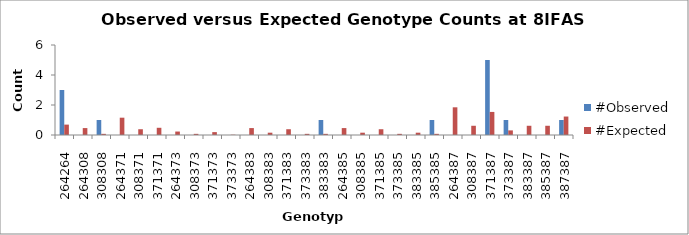
| Category | #Observed | #Expected |
|---|---|---|
| 264264.0 | 3 | 0.692 |
| 264308.0 | 0 | 0.462 |
| 308308.0 | 1 | 0.077 |
| 264371.0 | 0 | 1.154 |
| 308371.0 | 0 | 0.385 |
| 371371.0 | 0 | 0.481 |
| 264373.0 | 0 | 0.231 |
| 308373.0 | 0 | 0.077 |
| 371373.0 | 0 | 0.192 |
| 373373.0 | 0 | 0.019 |
| 264383.0 | 0 | 0.462 |
| 308383.0 | 0 | 0.154 |
| 371383.0 | 0 | 0.385 |
| 373383.0 | 0 | 0.077 |
| 383383.0 | 1 | 0.077 |
| 264385.0 | 0 | 0.462 |
| 308385.0 | 0 | 0.154 |
| 371385.0 | 0 | 0.385 |
| 373385.0 | 0 | 0.077 |
| 383385.0 | 0 | 0.154 |
| 385385.0 | 1 | 0.077 |
| 264387.0 | 0 | 1.846 |
| 308387.0 | 0 | 0.615 |
| 371387.0 | 5 | 1.538 |
| 373387.0 | 1 | 0.308 |
| 383387.0 | 0 | 0.615 |
| 385387.0 | 0 | 0.615 |
| 387387.0 | 1 | 1.231 |